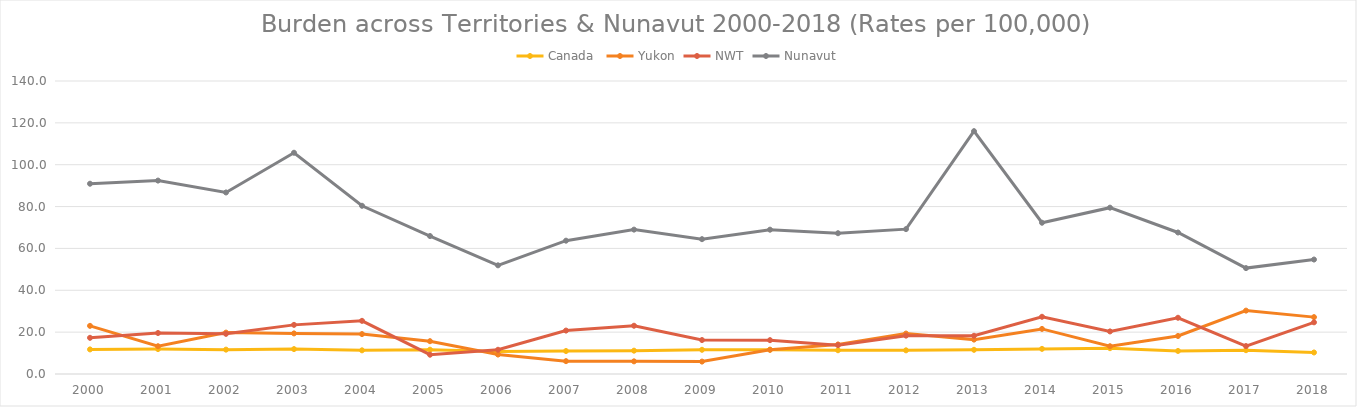
| Category | Canada  | Yukon | NWT | Nunavut |
|---|---|---|---|---|
| 2000.0 | 11.751 | 23.003 | 17.292 | 90.916 |
| 2001.0 | 11.902 | 13.263 | 19.586 | 92.418 |
| 2002.0 | 11.639 | 19.778 | 19.185 | 86.739 |
| 2003.0 | 11.898 | 19.392 | 23.474 | 105.723 |
| 2004.0 | 11.312 | 19.075 | 25.401 | 80.383 |
| 2005.0 | 11.608 | 15.673 | 9.217 | 65.922 |
| 2006.0 | 10.783 | 9.296 | 11.58 | 51.926 |
| 2007.0 | 10.979 | 6.144 | 20.751 | 63.704 |
| 2008.0 | 11.144 | 6.045 | 23.063 | 68.983 |
| 2009.0 | 11.567 | 5.929 | 16.22 | 64.423 |
| 2010.0 | 11.619 | 11.562 | 16.172 | 68.961 |
| 2011.0 | 11.346 | 14.12 | 13.792 | 67.267 |
| 2012.0 | 11.309 | 19.319 | 18.328 | 69.22 |
| 2013.0 | 11.555 | 16.429 | 18.263 | 116.026 |
| 2014.0 | 12.004 | 21.542 | 27.345 | 72.28 |
| 2015.0 | 12.338 | 13.266 | 20.345 | 79.478 |
| 2016.0 | 11.016 | 18.16 | 26.876 | 67.613 |
| 2017.0 | 11.376 | 30.282 | 13.352 | 50.597 |
| 2018.0 | 10.284 | 27.177 | 24.696 | 54.693 |